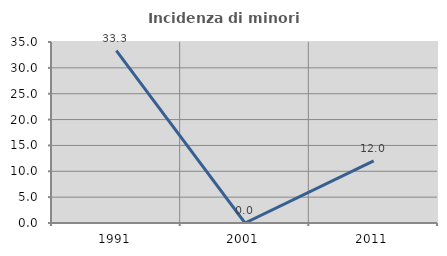
| Category | Incidenza di minori stranieri |
|---|---|
| 1991.0 | 33.333 |
| 2001.0 | 0 |
| 2011.0 | 12 |